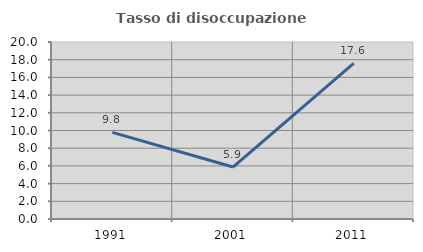
| Category | Tasso di disoccupazione giovanile  |
|---|---|
| 1991.0 | 9.792 |
| 2001.0 | 5.869 |
| 2011.0 | 17.595 |